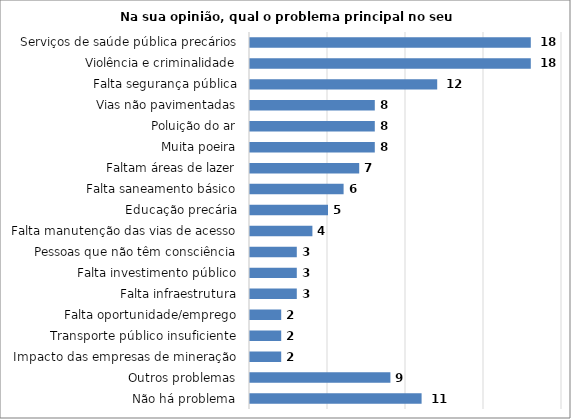
| Category | Series 0 |
|---|---|
| Não há problema | 11 |
| Outros problemas | 9 |
| Impacto das empresas de mineração | 2 |
| Transporte público insuficiente | 2 |
| Falta oportunidade/emprego | 2 |
| Falta infraestrutura | 3 |
| Falta investimento público | 3 |
| Pessoas que não têm consciência | 3 |
| Falta manutenção das vias de acesso | 4 |
| Educação precária | 5 |
| Falta saneamento básico | 6 |
| Faltam áreas de lazer | 7 |
| Muita poeira | 8 |
| Poluição do ar | 8 |
| Vias não pavimentadas | 8 |
| Falta segurança pública | 12 |
| Violência e criminalidade | 18 |
| Serviços de saúde pública precários | 18 |